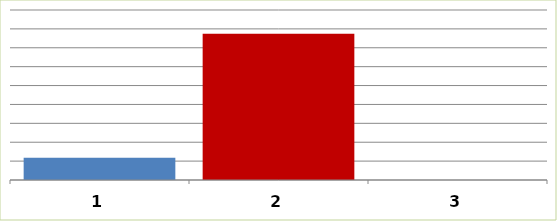
| Category | Series 0 |
|---|---|
| 0 | 11714300.89 |
| 1 | 77477908.68 |
| 2 | 0 |